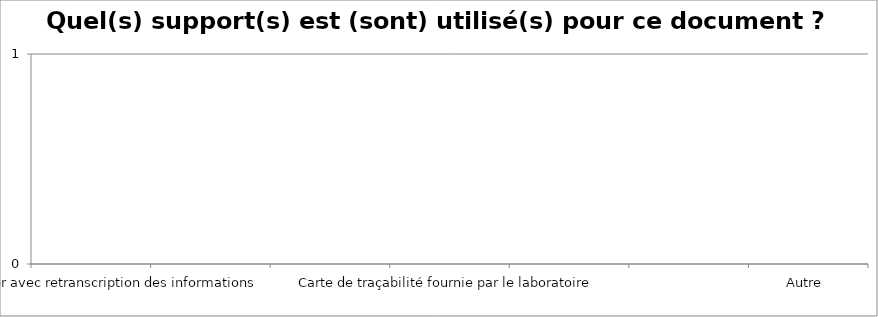
| Category | Quel(s) support(s) est (sont) utilisé(s) pour ce document ? - Choix multiple |
|---|---|
| Support papier avec retranscription des informations | 0 |
| Photocopie/fax de la fiche de traçabilité du bloc où sont collées les étiquettes | 0 |
| Edition d'un document de traçabilité à partir du logiciel de traçabilité du bloc opératoire | 0 |
| Carte de traçabilité fournie par le laboratoire | 0 |
| Edition d'un document de traçabilité à partir du logiciel pharmacie | 0 |
| Carte de traçabilité institutionnelle | 0 |
| Autre  | 0 |